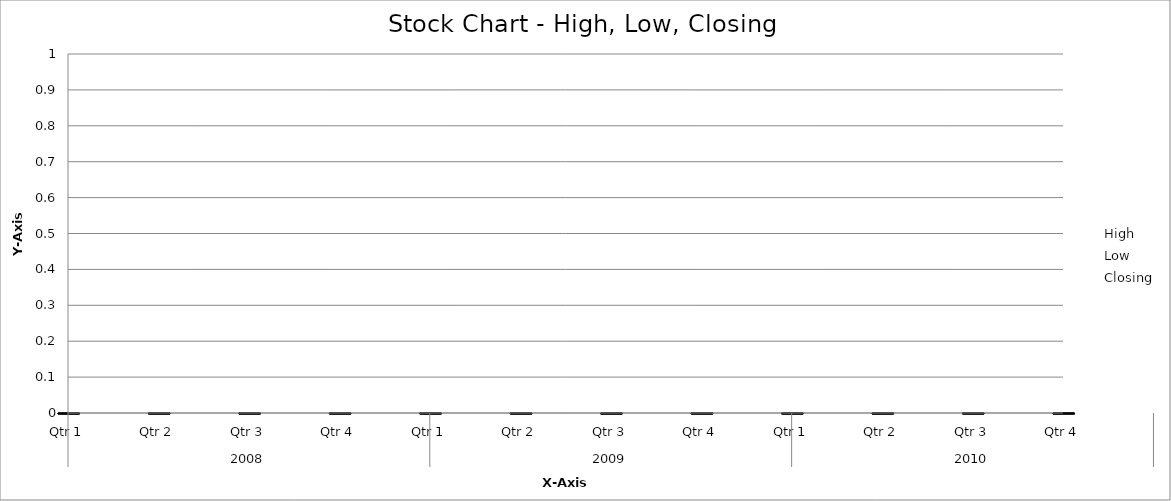
| Category | High | Low | Closing |
|---|---|---|---|
| 0 | 171 | 95 | 117 |
| 1 | 210 | 79 | 170 |
| 2 | 193 | 133 | 140 |
| 3 | 191 | 119 | 132 |
| 4 | 172 | 108 | 118 |
| 5 | 188 | 72 | 147 |
| 6 | 245 | 120 | 129 |
| 7 | 200 | 85 | 173 |
| 8 | 242 | 132 | 159 |
| 9 | 258 | 122 | 247 |
| 10 | 347 | 206 | 292 |
| 11 | 331 | 252 | 276 |